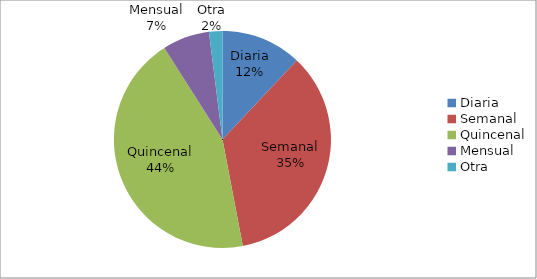
| Category | Series 0 |
|---|---|
| Diaria | 33.6 |
| Semanal | 98 |
| Quincenal | 123.2 |
| Mensual | 19.6 |
| Otra | 5.6 |